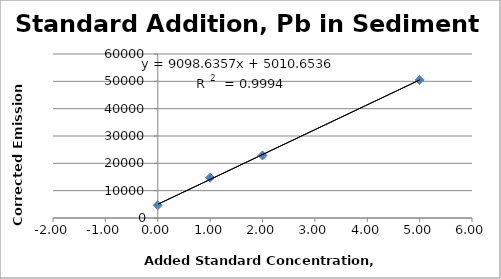
| Category | Series 0 |
|---|---|
| 0.0 | 4680.8 |
| 1.0 | 14769.8 |
| 2.0 | 22877 |
| 5.0 | 50504.1 |